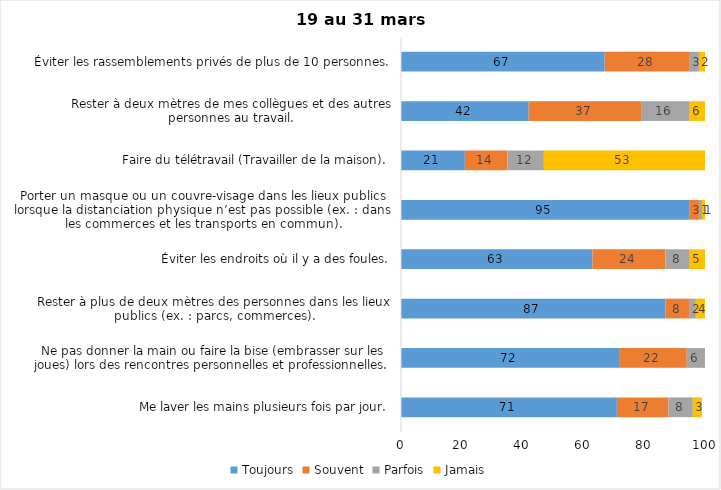
| Category | Toujours | Souvent | Parfois | Jamais |
|---|---|---|---|---|
| Me laver les mains plusieurs fois par jour. | 71 | 17 | 8 | 3 |
| Ne pas donner la main ou faire la bise (embrasser sur les joues) lors des rencontres personnelles et professionnelles. | 72 | 22 | 6 | 0 |
| Rester à plus de deux mètres des personnes dans les lieux publics (ex. : parcs, commerces). | 87 | 8 | 2 | 4 |
| Éviter les endroits où il y a des foules. | 63 | 24 | 8 | 5 |
| Porter un masque ou un couvre-visage dans les lieux publics lorsque la distanciation physique n’est pas possible (ex. : dans les commerces et les transports en commun). | 95 | 3 | 1 | 1 |
| Faire du télétravail (Travailler de la maison). | 21 | 14 | 12 | 53 |
| Rester à deux mètres de mes collègues et des autres personnes au travail. | 42 | 37 | 16 | 6 |
| Éviter les rassemblements privés de plus de 10 personnes. | 67 | 28 | 3 | 2 |